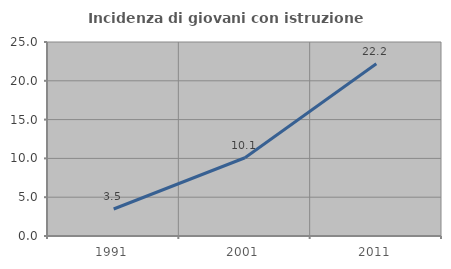
| Category | Incidenza di giovani con istruzione universitaria |
|---|---|
| 1991.0 | 3.479 |
| 2001.0 | 10.082 |
| 2011.0 | 22.189 |